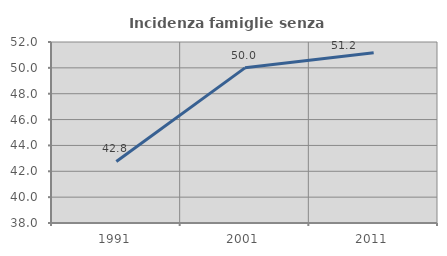
| Category | Incidenza famiglie senza nuclei |
|---|---|
| 1991.0 | 42.763 |
| 2001.0 | 50 |
| 2011.0 | 51.163 |